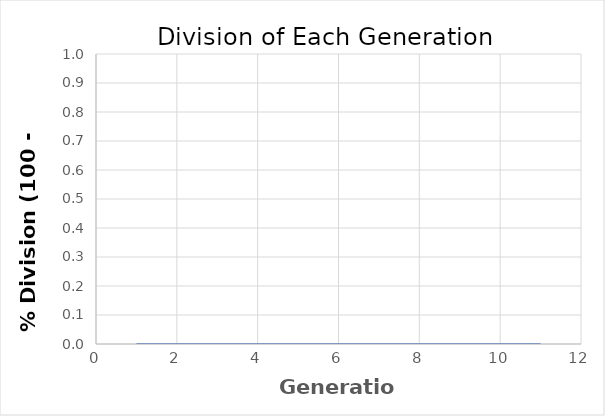
| Category | Series 0 |
|---|---|
| 1.0 | 0 |
| 2.0 | 0 |
| 3.0 | 0 |
| 4.0 | 0 |
| 5.0 | 0 |
| 6.0 | 0 |
| 7.0 | 0 |
| 8.0 | 0 |
| 9.0 | 0 |
| 10.0 | 0 |
| 11.0 | 0 |